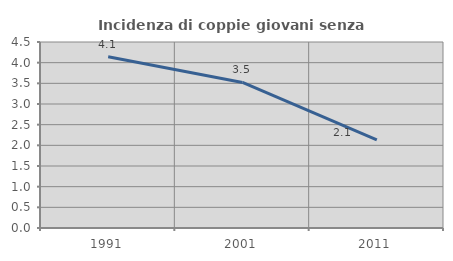
| Category | Incidenza di coppie giovani senza figli |
|---|---|
| 1991.0 | 4.141 |
| 2001.0 | 3.521 |
| 2011.0 | 2.129 |